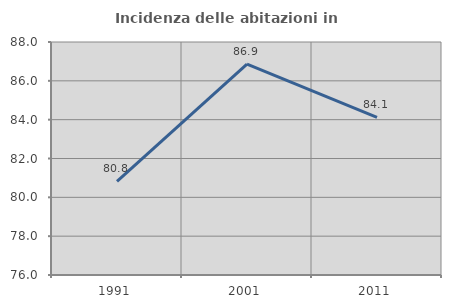
| Category | Incidenza delle abitazioni in proprietà  |
|---|---|
| 1991.0 | 80.822 |
| 2001.0 | 86.86 |
| 2011.0 | 84.114 |